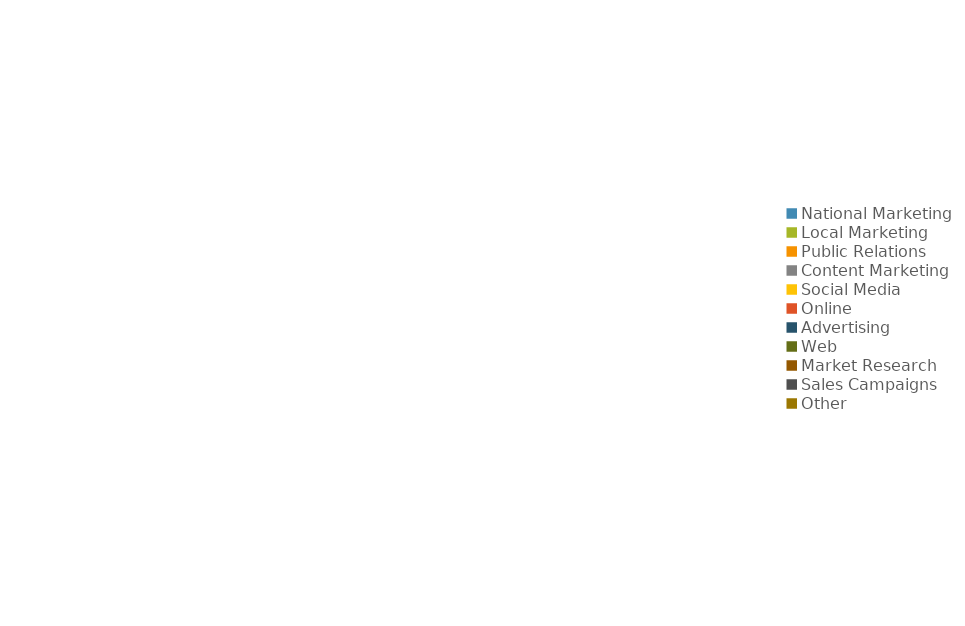
| Category | Series 0 | Series 1 |
|---|---|---|
| National Marketing | 0 | 0 |
| Local Marketing | 0 | 0 |
| Public Relations | 0 | 0 |
| Content Marketing | 0 | 0 |
| Social Media | 0 | 0 |
| Online | 0 | 0 |
| Advertising | 0 | 0 |
| Web | 0 | 0 |
| Market Research | 0 | 0 |
| Sales Campaigns | 0 | 0 |
| Other | 0 | 0 |